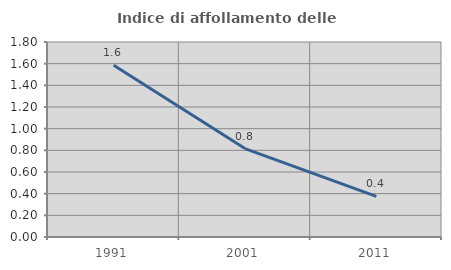
| Category | Indice di affollamento delle abitazioni  |
|---|---|
| 1991.0 | 1.585 |
| 2001.0 | 0.816 |
| 2011.0 | 0.375 |